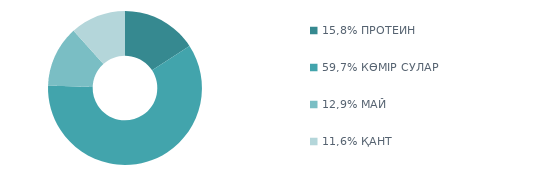
| Category | Series 0 |
|---|---|
| 15,8% ПРОТЕИН | 915 |
| 59,7% КӨМІР СУЛАР | 3460 |
| 12,9% МАЙ | 745 |
| 11,6% ҚАНТ | 675 |